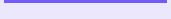
| Category | Series 0 | Series 1 |
|---|---|---|
| 0 | 1.014 | -0.014 |